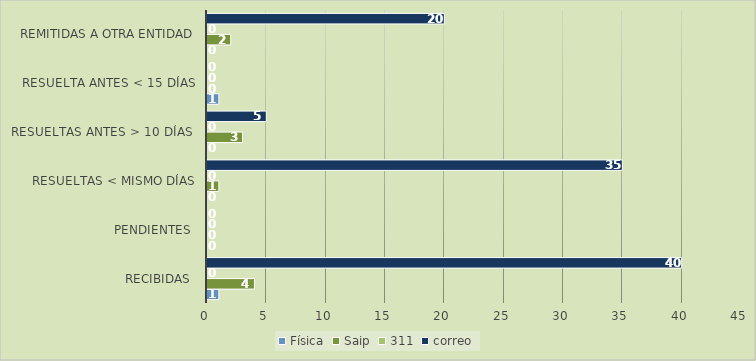
| Category | Física | Saip | 311 | correo |
|---|---|---|---|---|
| Recibidas  | 1 | 4 | 0 | 40 |
| Pendientes  | 0 | 0 | 0 | 0 |
| Resueltas < mismo días | 0 | 1 | 0 | 35 |
| Resueltas antes > 10 días  | 0 | 3 | 0 | 5 |
| Resuelta antes < 15 días | 1 | 0 | 0 | 0 |
| Remitidas a otra entidad | 0 | 2 | 0 | 20 |